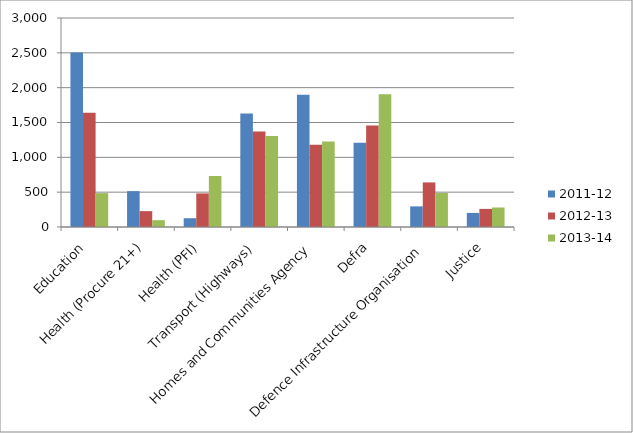
| Category | 2011-12 | 2012-13 | 2013-14 |
|---|---|---|---|
| Education | 2504 | 1640 | 486 |
| Health (Procure 21+) | 515 | 228 | 98 |
| Health (PFI) | 126 | 482 | 732 |
| Transport (Highways) | 1628 | 1370 | 1308 |
| Homes and Communities Agency | 1900 | 1182 | 1229 |
| Defra | 1211 | 1457 | 1907 |
| Defence Infrastructure Organisation | 296 | 640 | 488 |
| Justice | 202 | 260 | 280 |